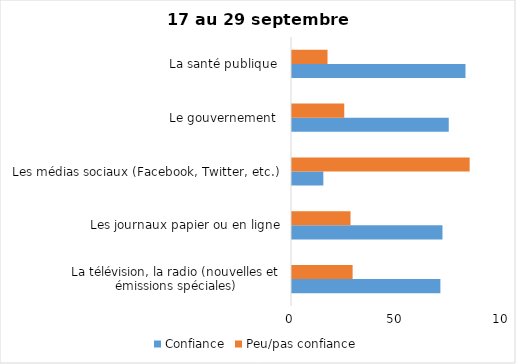
| Category | Confiance | Peu/pas confiance |
|---|---|---|
| La télévision, la radio (nouvelles et émissions spéciales) | 71 | 29 |
| Les journaux papier ou en ligne | 72 | 28 |
| Les médias sociaux (Facebook, Twitter, etc.) | 15 | 85 |
| Le gouvernement  | 75 | 25 |
| La santé publique  | 83 | 17 |